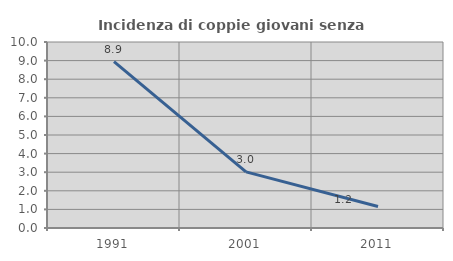
| Category | Incidenza di coppie giovani senza figli |
|---|---|
| 1991.0 | 8.947 |
| 2001.0 | 3.015 |
| 2011.0 | 1.156 |